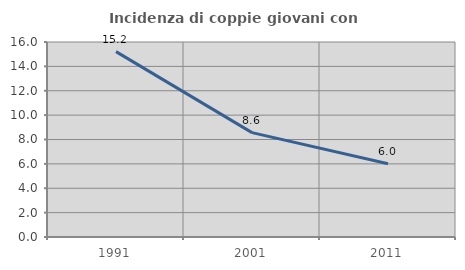
| Category | Incidenza di coppie giovani con figli |
|---|---|
| 1991.0 | 15.213 |
| 2001.0 | 8.564 |
| 2011.0 | 6.014 |